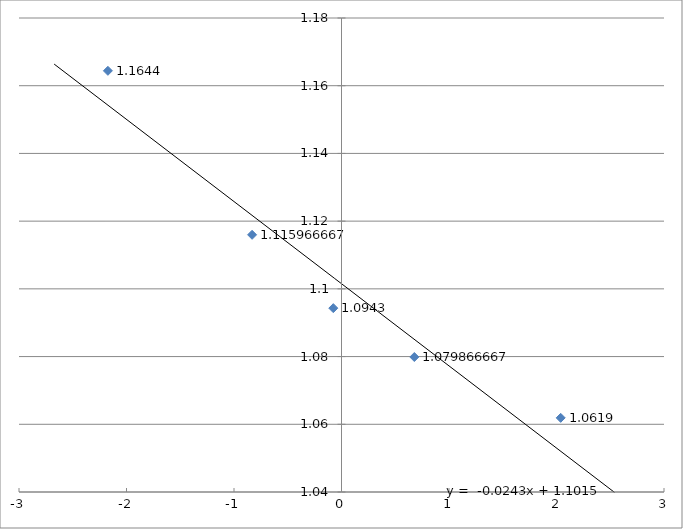
| Category | Series 0 |
|---|---|
| -2.173106017574471 | 1.164 |
| -0.831733343846092 | 1.116 |
| -0.0763729787845741 | 1.094 |
| 0.6773988235918061 | 1.08 |
| 2.039000572121325 | 1.062 |